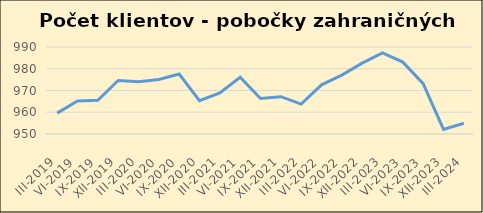
| Category | Series 0 |
|---|---|
| III-2019 | 959612 |
| VI-2019 | 965197 |
| IX-2019 | 965519 |
| XII-2019 | 974616 |
| III-2020 | 974022 |
| VI-2020 | 975031 |
| IX-2020 | 977551 |
| XII-2020 | 965357 |
| III-2021 | 968844 |
| VI-2021 | 976076 |
| IX-2021 | 966303 |
| XII-2021 | 967153 |
| III-2022 | 963741 |
| VI-2022 | 972609 |
| IX-2022 | 977093 |
| XII-2022 | 982568 |
| III-2023 | 987331 |
| VI-2023 | 983055 |
| IX-2023 | 973143 |
| XII-2023 | 952114 |
| III-2024 | 954960 |